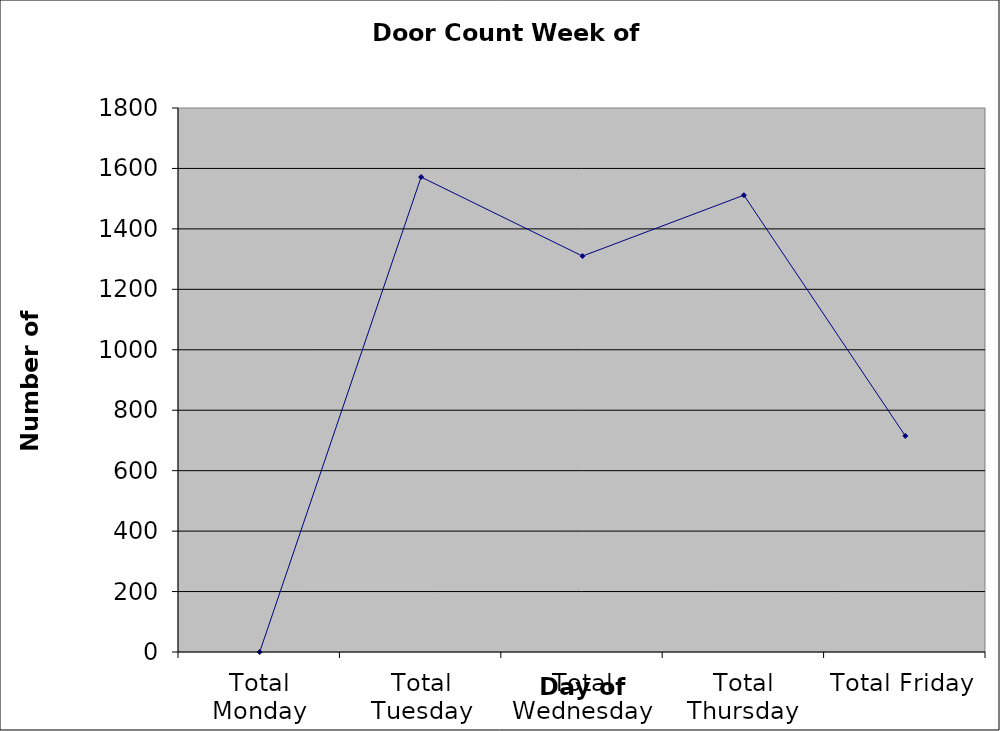
| Category | Series 0 |
|---|---|
| Total Monday | 0 |
| Total Tuesday | 1571.5 |
| Total Wednesday | 1310 |
| Total Thursday | 1511.5 |
| Total Friday | 715 |